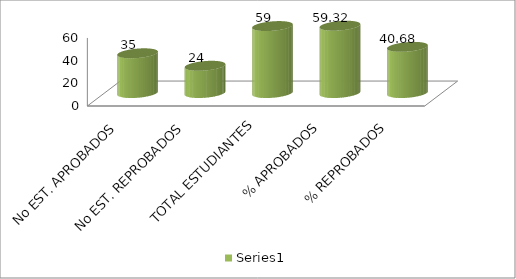
| Category | Series 0 |
|---|---|
| No EST. APROBADOS | 35 |
| No EST. REPROBADOS | 24 |
| TOTAL ESTUDIANTES | 59 |
| % APROBADOS | 59.322 |
| % REPROBADOS | 40.678 |